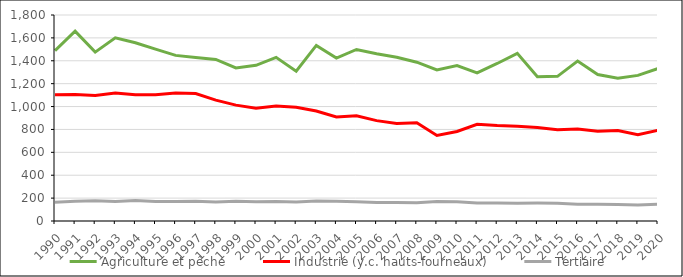
| Category | Agriculture et pêche | Industrie (y.c. hauts-fourneaux) | Tertiaire |
|---|---|---|---|
| 1990.0 | 1489.21 | 1104.184 | 164.633 |
| 1991.0 | 1659.095 | 1105.861 | 171.818 |
| 1992.0 | 1475.577 | 1097.27 | 177.232 |
| 1993.0 | 1600.454 | 1119.147 | 170.357 |
| 1994.0 | 1557.112 | 1104.193 | 178.042 |
| 1995.0 | 1501.467 | 1102.13 | 170.779 |
| 1996.0 | 1446.996 | 1117.615 | 171.341 |
| 1997.0 | 1427.773 | 1114.224 | 172.84 |
| 1998.0 | 1411.938 | 1055.99 | 166.734 |
| 1999.0 | 1337.764 | 1012.379 | 172.371 |
| 2000.0 | 1360.167 | 985.575 | 167.166 |
| 2001.0 | 1429.991 | 1004.482 | 169.677 |
| 2002.0 | 1308.131 | 993.313 | 166.135 |
| 2003.0 | 1534.148 | 960.423 | 174.131 |
| 2004.0 | 1423.379 | 908.764 | 172.873 |
| 2005.0 | 1499.054 | 920.25 | 168.846 |
| 2006.0 | 1461.726 | 876.931 | 161.34 |
| 2007.0 | 1430.512 | 851.456 | 162.303 |
| 2008.0 | 1387.701 | 857.794 | 158.761 |
| 2009.0 | 1320.487 | 747.128 | 171.236 |
| 2010.0 | 1357.489 | 782.127 | 167.201 |
| 2011.0 | 1294.743 | 844.426 | 157.56 |
| 2012.0 | 1376.4 | 833.584 | 156.743 |
| 2013.0 | 1464.913 | 827.209 | 155.594 |
| 2014.0 | 1261.023 | 816.89 | 156.871 |
| 2015.0 | 1264.122 | 796.522 | 154.658 |
| 2016.0 | 1397.129 | 804.374 | 146.017 |
| 2017.0 | 1279.585 | 785.044 | 147.277 |
| 2018.0 | 1247.841 | 791.307 | 144.721 |
| 2019.0 | 1272.444 | 754.703 | 140.044 |
| 2020.0 | 1332.956 | 793.463 | 146.252 |